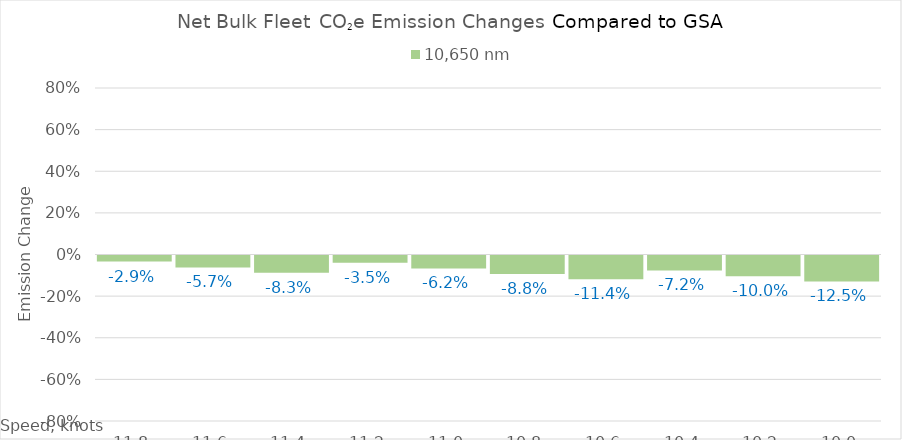
| Category | 10,650 |
|---|---|
| 11.8 | -0.029 |
| 11.600000000000001 | -0.057 |
| 11.400000000000002 | -0.083 |
| 11.200000000000003 | -0.035 |
| 11.000000000000004 | -0.062 |
| 10.800000000000004 | -0.088 |
| 10.600000000000005 | -0.114 |
| 10.400000000000006 | -0.072 |
| 10.200000000000006 | -0.1 |
| 10.000000000000007 | -0.125 |